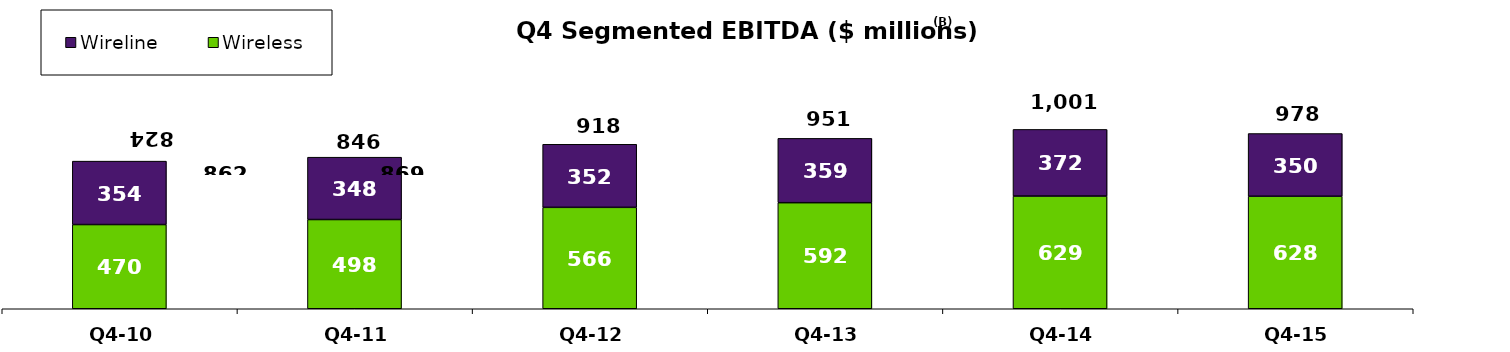
| Category | Wireless | Wireline |
|---|---|---|
| Q4-10 | 470 | 354 |
| Q4-11 | 498 | 348 |
| Q4-12 | 566 | 352 |
| Q4-13 | 592 | 359 |
| Q4-14 | 629 | 372 |
| Q4-15 | 628 | 350 |